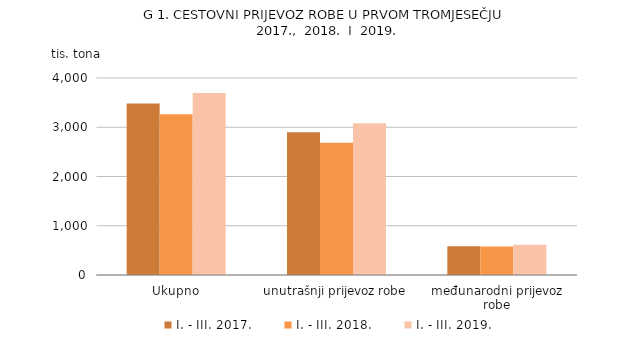
| Category | I. - III. 2017. | I. - III. 2018. | I. - III. 2019. |
|---|---|---|---|
| Ukupno | 3481 | 3265 | 3695 |
| unutrašnji prijevoz robe | 2899 | 2686 | 3082 |
| međunarodni prijevoz robe | 582 | 579 | 613 |